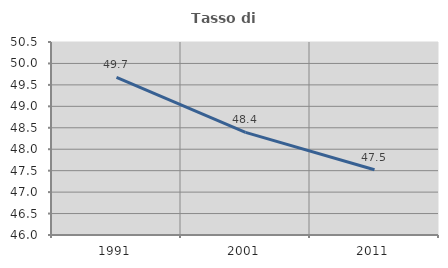
| Category | Tasso di occupazione   |
|---|---|
| 1991.0 | 49.677 |
| 2001.0 | 48.394 |
| 2011.0 | 47.523 |